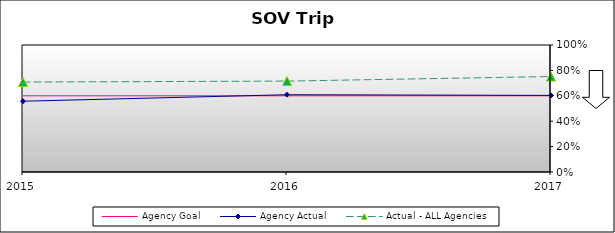
| Category | Agency Goal | Agency Actual | Actual - ALL Agencies |
|---|---|---|---|
| 2015.0 | 0.6 | 0.557 | 0.708 |
| 2016.0 | 0.6 | 0.609 | 0.716 |
| 2017.0 | 0.6 | 0.603 | 0.752 |